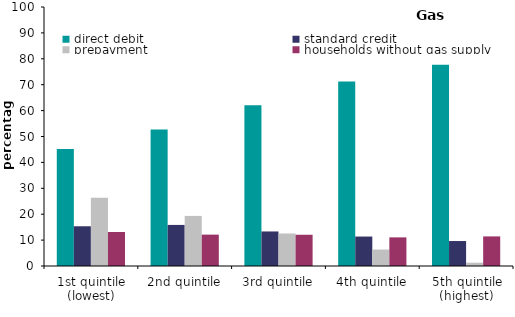
| Category | direct debit | standard credit | prepayment | households without gas supply |
|---|---|---|---|---|
| 1st quintile (lowest) | 45.17 | 15.339 | 26.368 | 13.123 |
| 2nd quintile | 52.688 | 15.861 | 19.34 | 12.111 |
| 3rd quintile | 62.046 | 13.335 | 12.554 | 12.065 |
| 4th quintile | 71.222 | 11.371 | 6.356 | 11.051 |
| 5th quintile (highest) | 77.664 | 9.64 | 1.272 | 11.424 |